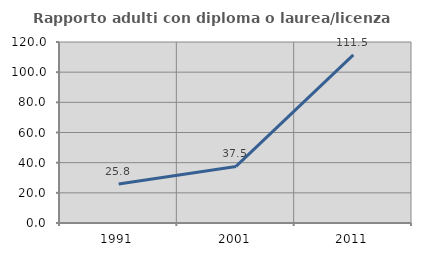
| Category | Rapporto adulti con diploma o laurea/licenza media  |
|---|---|
| 1991.0 | 25.823 |
| 2001.0 | 37.522 |
| 2011.0 | 111.452 |